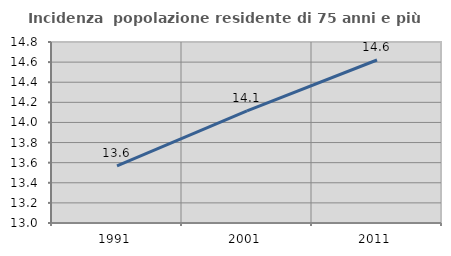
| Category | Incidenza  popolazione residente di 75 anni e più |
|---|---|
| 1991.0 | 13.567 |
| 2001.0 | 14.115 |
| 2011.0 | 14.621 |